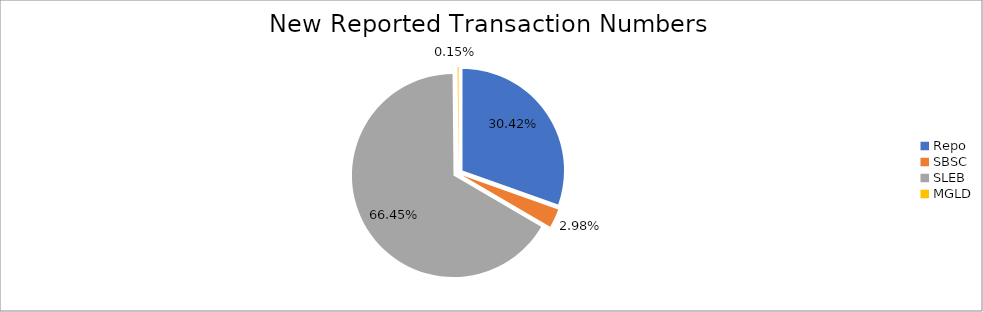
| Category | Series 0 |
|---|---|
| Repo | 420867 |
| SBSC | 41229 |
| SLEB | 919174 |
| MGLD | 2033 |